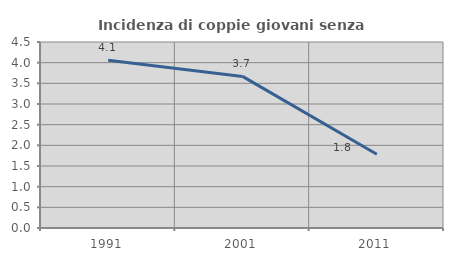
| Category | Incidenza di coppie giovani senza figli |
|---|---|
| 1991.0 | 4.056 |
| 2001.0 | 3.668 |
| 2011.0 | 1.785 |